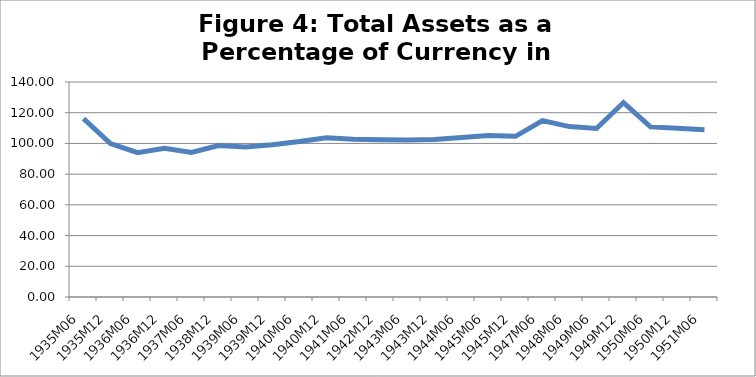
| Category | Figure 4: Total Assets as a Percentage of Currency in Ciruclation (Contiuous) |
|---|---|
| 1935M06 | 116.096 |
| 1935M12 | 99.949 |
| 1936M06 | 93.952 |
| 1936M12 | 96.904 |
| 1937M06 | 94.064 |
| 1938M12 | 98.593 |
| 1939M06 | 97.727 |
| 1939M12 | 99.141 |
| 1940M06 | 101.25 |
| 1940M12 | 103.754 |
| 1941M06 | 102.757 |
| 1942M12 | 102.343 |
| 1943M06 | 102.311 |
| 1943M12 | 102.616 |
| 1944M06 | 103.86 |
| 1945M06 | 105.176 |
| 1945M12 | 104.634 |
| 1947M06 | 114.859 |
| 1948M06 | 110.962 |
| 1949M06 | 109.738 |
| 1949M12 | 126.617 |
| 1950M06 | 110.76 |
| 1950M12 | 109.89 |
| 1951M06 | 108.896 |